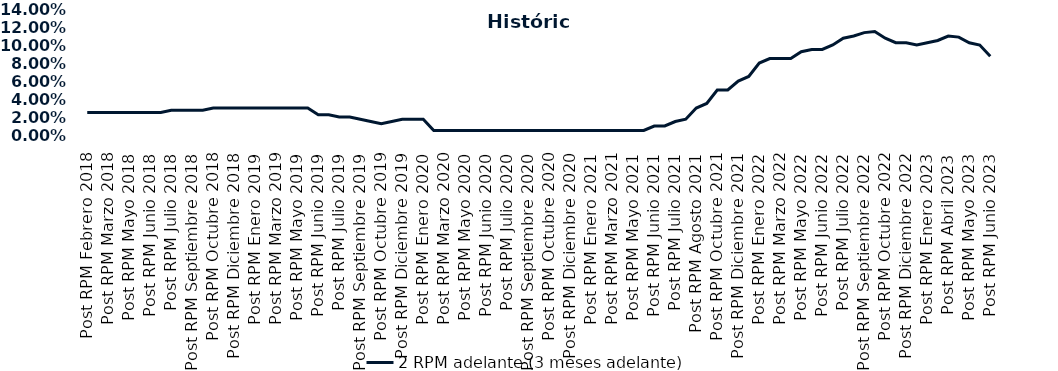
| Category | 2 RPM adelante (3 meses adelante) |
|---|---|
| Post RPM Febrero 2018 | 0.025 |
| Pre RPM Marzo 2018 | 0.025 |
| Post RPM Marzo 2018 | 0.025 |
| Pre RPM Mayo 2018 | 0.025 |
| Post RPM Mayo 2018 | 0.025 |
| Pre RPM Junio 2018 | 0.025 |
| Post RPM Junio 2018 | 0.025 |
| Pre RPM Julio 2018 | 0.025 |
| Post RPM Julio 2018 | 0.028 |
| Pre RPM Septiembre 2018 | 0.028 |
| Post RPM Septiembre 2018 | 0.028 |
| Pre RPM Octubre 2018 | 0.028 |
| Post RPM Octubre 2018 | 0.03 |
| Pre RPM Diciembre 2018 | 0.03 |
| Post RPM Diciembre 2018 | 0.03 |
| Pre RPM Enero 2019 | 0.03 |
| Post RPM Enero 2019 | 0.03 |
| Pre RPM Marzo 2019 | 0.03 |
| Post RPM Marzo 2019 | 0.03 |
| Pre RPM Mayo 2019 | 0.03 |
| Post RPM Mayo 2019 | 0.03 |
| Pre RPM Junio 2019 | 0.03 |
| Post RPM Junio 2019 | 0.022 |
| Pre RPM Julio 2019 | 0.022 |
| Post RPM Julio 2019 | 0.02 |
| Pre RPM Septiembre 2019 | 0.02 |
| Post RPM Septiembre 2019 | 0.018 |
| Pre RPM Octubre 2019 | 0.015 |
| Post RPM Octubre 2019 | 0.012 |
| Pre RPM Diciembre 2019 | 0.015 |
| Post RPM Diciembre 2019 | 0.018 |
| Pre RPM Enero 2020 | 0.018 |
| Post RPM Enero 2020 | 0.018 |
| Pre RPM Marzo 2020 | 0.005 |
| Post RPM Marzo 2020 | 0.005 |
| Pre RPM Mayo 2020 | 0.005 |
| Post RPM Mayo 2020 | 0.005 |
| Pre RPM Junio 2020 | 0.005 |
| Post RPM Junio 2020 | 0.005 |
| Pre RPM Julio 2020 | 0.005 |
| Post RPM Julio 2020 | 0.005 |
| Pre RPM Septiembre 2020 | 0.005 |
| Post RPM Septiembre 2020 | 0.005 |
| Pre RPM Octubre 2020 | 0.005 |
| Post RPM Octubre 2020 | 0.005 |
| Pre RPM Diciembre 2020 | 0.005 |
| Post RPM Diciembre 2020 | 0.005 |
| Pre RPM Enero 2021 | 0.005 |
| Post RPM Enero 2021 | 0.005 |
| Pre RPM Marzo 2021 | 0.005 |
| Post RPM Marzo 2021 | 0.005 |
| Pre RPM Mayo 2021 | 0.005 |
| Post RPM Mayo 2021 | 0.005 |
| Pre RPM Junio 2021 | 0.005 |
| Post RPM Junio 2021 | 0.01 |
| Pre RPM Julio 2021 | 0.01 |
| Post RPM Julio 2021 | 0.015 |
| Pre RPM Agosto 2021 | 0.018 |
| Post RPM Agosto 2021 | 0.03 |
| Pre RPM Octubre 2021 | 0.035 |
| Post RPM Octubre 2021 | 0.05 |
| Pre RPM Diciembre 2021 | 0.05 |
| Post RPM Diciembre 2021 | 0.06 |
| Pre RPM Enero 2022 | 0.065 |
| Post RPM Enero 2022 | 0.08 |
| Pre RPM Marzo 2022 | 0.085 |
| Post RPM Marzo 2022 | 0.085 |
| Pre RPM Mayo 2022 | 0.085 |
| Post RPM Mayo 2022 | 0.092 |
| Pre RPM Junio 2022 | 0.095 |
| Post RPM Junio 2022 | 0.095 |
| Pre RPM Julio 2022 | 0.1 |
| Post RPM Julio 2022 | 0.108 |
| Pre RPM Septiembre 2022 | 0.11 |
| Post RPM Septiembre 2022 | 0.114 |
| Pre RPM Octubre 2022 | 0.115 |
| Post RPM Octubre 2022 | 0.108 |
| Pre RPM Diciembre 2022 | 0.102 |
| Post RPM Diciembre 2022 | 0.102 |
| Pre RPM Enero 2023 | 0.1 |
| Post RPM Enero 2023 | 0.102 |
| Pre RPM Abril 2023 | 0.105 |
| Post RPM Abril 2023 | 0.11 |
| Pre RPM Mayo 2023 | 0.109 |
| Post RPM Mayo 2023 | 0.102 |
| Pre RPM Junio 2023 | 0.1 |
| Post RPM Junio 2023 | 0.088 |